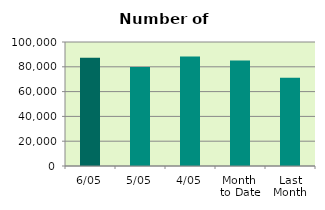
| Category | Series 0 |
|---|---|
| 6/05 | 87278 |
| 5/05 | 79744 |
| 4/05 | 88332 |
| Month 
to Date | 85118 |
| Last
Month | 71251.4 |